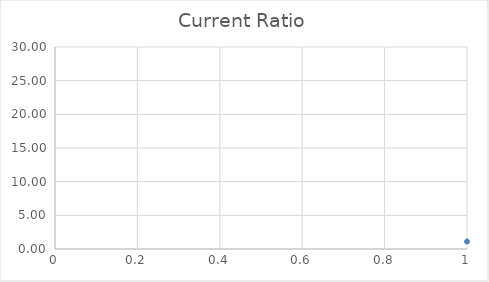
| Category | Series 0 |
|---|---|
| 0 | 1.109 |
| 1 | 1.11 |
| 2 | 1.343 |
| 3 | 1.363 |
| 4 | 1.421 |
| 5 | 1.48 |
| 6 | 1.542 |
| 7 | 1.764 |
| 8 | 1.871 |
| 9 | 1.952 |
| 10 | 1.954 |
| 11 | 1.955 |
| 12 | 2.016 |
| 13 | 2.105 |
| 14 | 2.216 |
| 15 | 2.233 |
| 16 | 2.284 |
| 17 | 2.312 |
| 18 | 2.347 |
| 19 | 2.405 |
| 20 | 2.435 |
| 21 | 2.458 |
| 22 | 2.458 |
| 23 | 2.512 |
| 24 | 2.732 |
| 25 | 2.799 |
| 26 | 2.811 |
| 27 | 2.957 |
| 28 | 3.063 |
| 29 | 3.319 |
| 30 | 3.363 |
| 31 | 3.389 |
| 32 | 3.592 |
| 33 | 3.592 |
| 34 | 3.719 |
| 35 | 3.827 |
| 36 | 3.976 |
| 37 | 4.771 |
| 38 | 5.224 |
| 39 | 5.293 |
| 40 | 5.417 |
| 41 | 5.475 |
| 42 | 5.535 |
| 43 | 6.308 |
| 44 | 7.125 |
| 45 | 7.484 |
| 46 | 8.515 |
| 47 | 10.006 |
| 48 | 10.07 |
| 49 | 25.72 |